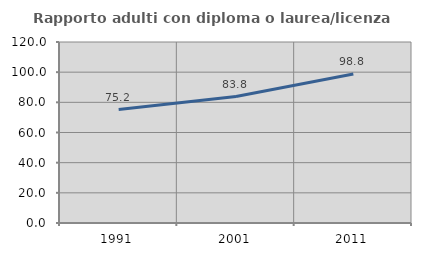
| Category | Rapporto adulti con diploma o laurea/licenza media  |
|---|---|
| 1991.0 | 75.209 |
| 2001.0 | 83.827 |
| 2011.0 | 98.753 |